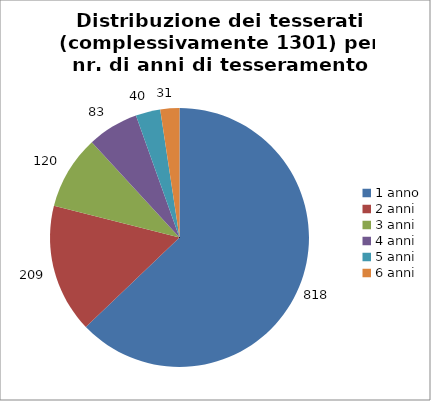
| Category | Nr. Tesserati |
|---|---|
| 1 anno | 818 |
| 2 anni | 209 |
| 3 anni | 120 |
| 4 anni | 83 |
| 5 anni | 40 |
| 6 anni | 31 |